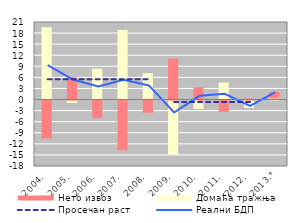
| Category | Домаћа тражњa | Нето извоз |
|---|---|---|
| 2004. | 19.602 | -10.27 |
| 2005. | -0.667 | 6.07 |
| 2006. | 8.352 | -4.795 |
| 2007. | 18.857 | -13.475 |
| 2008. | 7.129 | -3.31 |
| 2009. | -14.594 | 11.088 |
| 2010. | -2.292 | 3.299 |
| 2011. | 4.63 | -3.063 |
| 2012. | -2.01 | 0.264 |
| 2013.* | 0.527 | 1.513 |